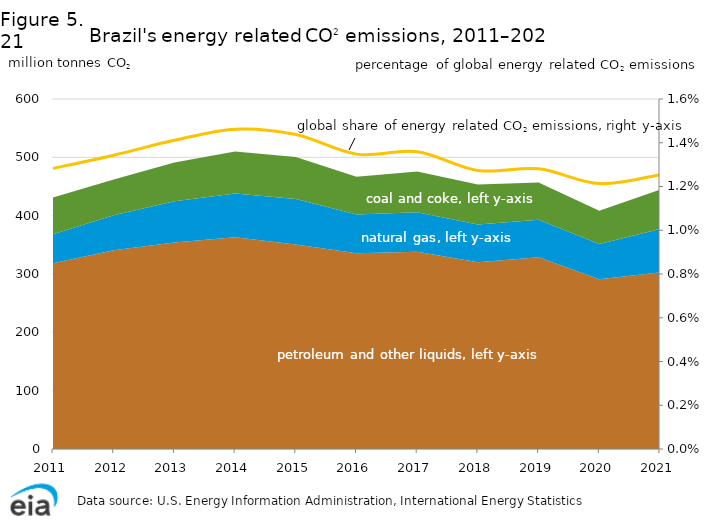
| Category | global share of CO2 energy related emissions (percentage) |
|---|---|
| 2011.0 | 0.013 |
| 2012.0 | 0.013 |
| 2013.0 | 0.014 |
| 2014.0 | 0.015 |
| 2015.0 | 0.014 |
| 2016.0 | 0.013 |
| 2017.0 | 0.014 |
| 2018.0 | 0.013 |
| 2019.0 | 0.013 |
| 2020.0 | 0.012 |
| 2021.0 | 0.013 |